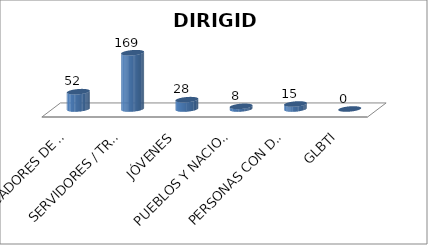
| Category | Series 0 |
|---|---|
| BÚSCADORES DE EMPLEO | 52 |
| SERVIDORES / TRABAJADORES | 169 |
| JÓVENES | 28 |
| PUEBLOS Y NACIONALIDADES | 8 |
| PERSONAS CON DISCAPACIDAD | 15 |
| GLBTI | 0 |